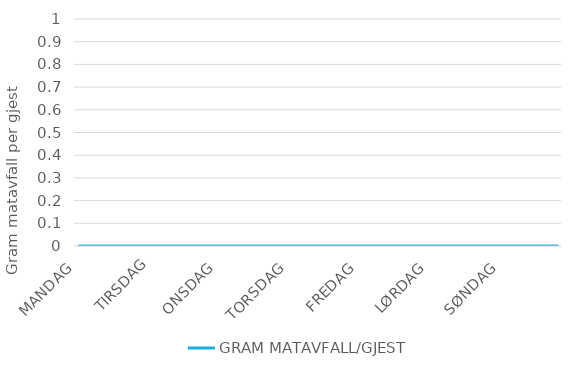
| Category |  GRAM MATAVFALL/GJEST  |
|---|---|
| MANDAG | 0 |
|  | 0 |
|  | 0 |
|  | 0 |
|  | 0 |
|  | 0 |
|  | 0 |
|  | 0 |
|  | 0 |
|  | 0 |
| TIRSDAG | 0 |
|  | 0 |
|  | 0 |
|  | 0 |
|  | 0 |
|  | 0 |
|  | 0 |
|  | 0 |
|  | 0 |
|  | 0 |
| ONSDAG | 0 |
|  | 0 |
|  | 0 |
|  | 0 |
|  | 0 |
|  | 0 |
|  | 0 |
|  | 0 |
|  | 0 |
|  | 0 |
| TORSDAG | 0 |
|  | 0 |
|  | 0 |
|  | 0 |
|  | 0 |
|  | 0 |
|  | 0 |
|  | 0 |
|  | 0 |
|  | 0 |
| FREDAG | 0 |
|  | 0 |
|  | 0 |
|  | 0 |
|  | 0 |
|  | 0 |
|  | 0 |
|  | 0 |
|  | 0 |
|  | 0 |
| LØRDAG | 0 |
|  | 0 |
|  | 0 |
|  | 0 |
|  | 0 |
|  | 0 |
|  | 0 |
|  | 0 |
|  | 0 |
|  | 0 |
| SØNDAG | 0 |